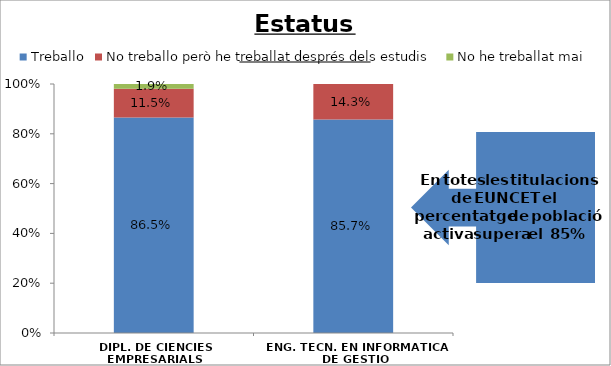
| Category | Treballo | No treballo però he treballat després dels estudis | No he treballat mai |
|---|---|---|---|
| DIPL. DE CIENCIES EMPRESARIALS | 0.865 | 0.115 | 0.019 |
| ENG. TECN. EN INFORMATICA DE GESTIO | 0.857 | 0.143 | 0 |